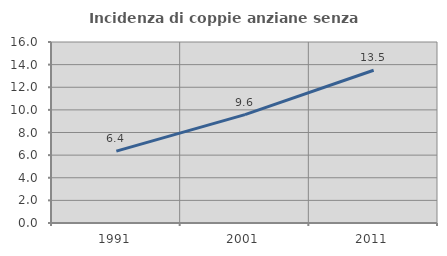
| Category | Incidenza di coppie anziane senza figli  |
|---|---|
| 1991.0 | 6.354 |
| 2001.0 | 9.58 |
| 2011.0 | 13.5 |